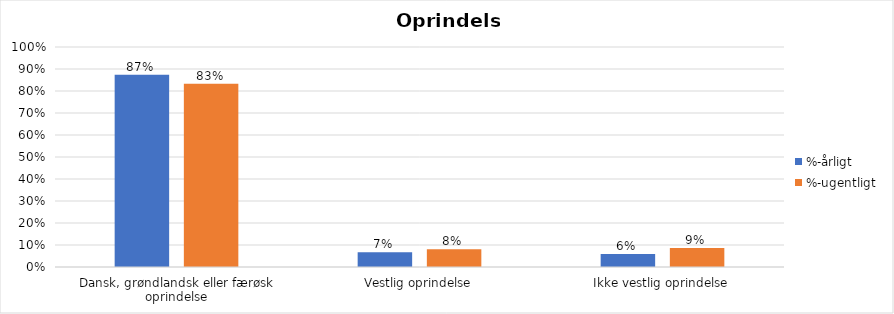
| Category | %-årligt | %-ugentligt |
|---|---|---|
| Dansk, grøndlandsk eller færøsk oprindelse | 0.873 | 0.833 |
| Vestlig oprindelse | 0.068 | 0.08 |
| Ikke vestlig oprindelse | 0.059 | 0.086 |